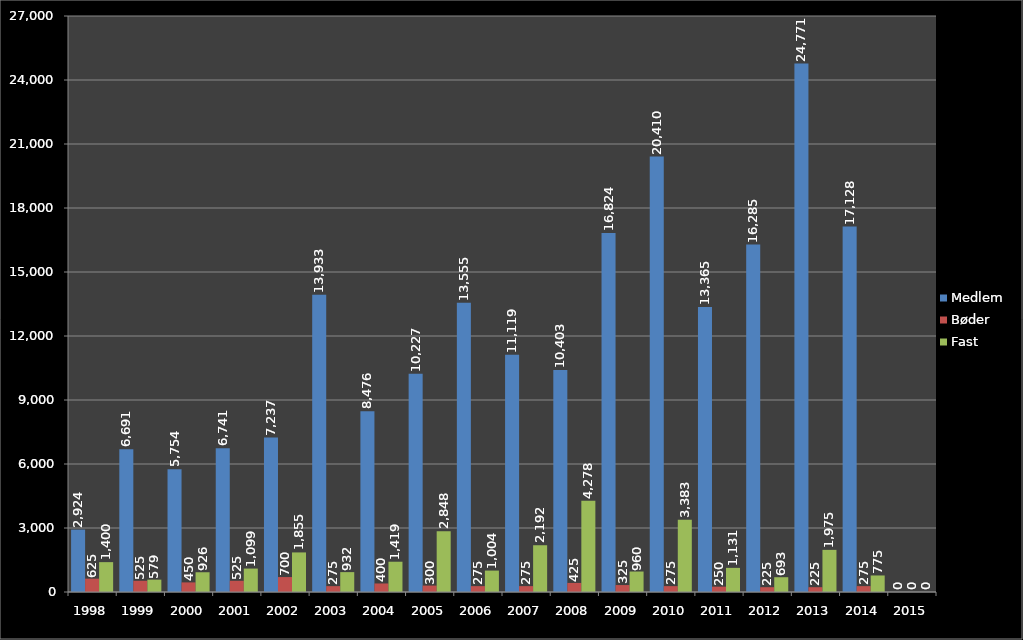
| Category | Medlem | Bøder | Fast |
|---|---|---|---|
| 1998.0 | 2924 | 625 | 1400 |
| 1999.0 | 6691 | 525 | 579 |
| 2000.0 | 5754 | 450 | 926 |
| 2001.0 | 6741 | 525 | 1099 |
| 2002.0 | 7237 | 700 | 1855 |
| 2003.0 | 13933 | 275 | 932 |
| 2004.0 | 8476 | 400 | 1419 |
| 2005.0 | 10227 | 300 | 2848 |
| 2006.0 | 13555 | 275 | 1004 |
| 2007.0 | 11119 | 275 | 2192 |
| 2008.0 | 10403 | 425 | 4278 |
| 2009.0 | 16824 | 325 | 960 |
| 2010.0 | 20410 | 275 | 3383 |
| 2011.0 | 13365 | 250 | 1131 |
| 2012.0 | 16285 | 225 | 693 |
| 2013.0 | 24771 | 225 | 1975 |
| 2014.0 | 17128 | 275 | 775 |
| 2015.0 | 0 | 0 | 0 |